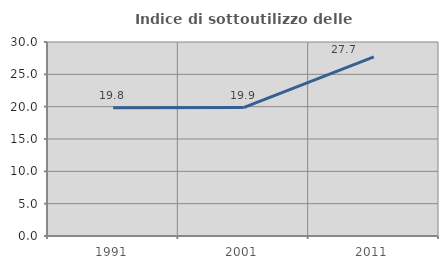
| Category | Indice di sottoutilizzo delle abitazioni  |
|---|---|
| 1991.0 | 19.825 |
| 2001.0 | 19.852 |
| 2011.0 | 27.688 |